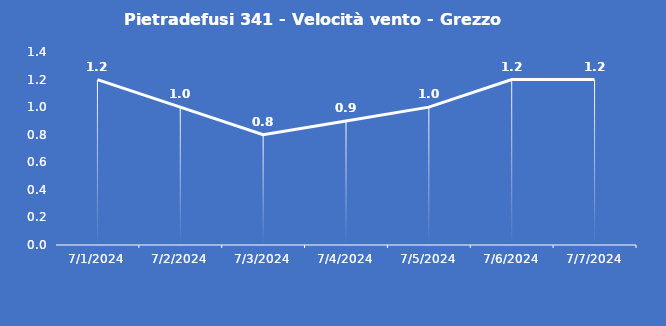
| Category | Pietradefusi 341 - Velocità vento - Grezzo (m/s) |
|---|---|
| 7/1/24 | 1.2 |
| 7/2/24 | 1 |
| 7/3/24 | 0.8 |
| 7/4/24 | 0.9 |
| 7/5/24 | 1 |
| 7/6/24 | 1.2 |
| 7/7/24 | 1.2 |